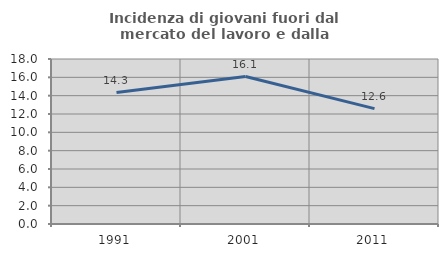
| Category | Incidenza di giovani fuori dal mercato del lavoro e dalla formazione  |
|---|---|
| 1991.0 | 14.34 |
| 2001.0 | 16.087 |
| 2011.0 | 12.589 |